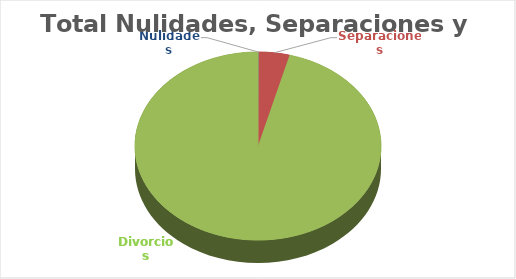
| Category | Series 0 |
|---|---|
| Nulidades | 57 |
| Separaciones | 3674 |
| Divorcios | 86851 |